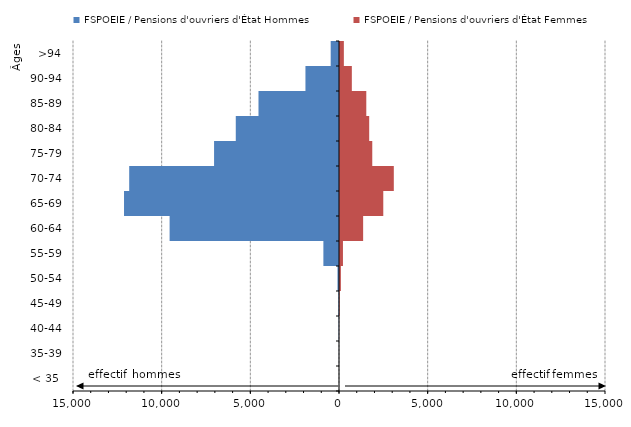
| Category | FSPOEIE / Pensions d'ouvriers d'État Hommes | FSPOEIE / Pensions d'ouvriers d'État Femmes |
|---|---|---|
| < 35  | 0 | 0 |
| 35-39 | -3 | 1 |
| 40-44 | -16 | 5 |
| 45-49 | -29 | 35 |
| 50-54 | -85 | 106 |
| 55-59 | -881 | 223 |
| 60-64 | -9552 | 1361 |
| 65-69 | -12123 | 2497 |
| 70-74 | -11831 | 3091 |
| 75-79 | -7045 | 1876 |
| 80-84 | -5821 | 1703 |
| 85-89 | -4540 | 1539 |
| 90-94 | -1892 | 724 |
| >94 | -469 | 274 |